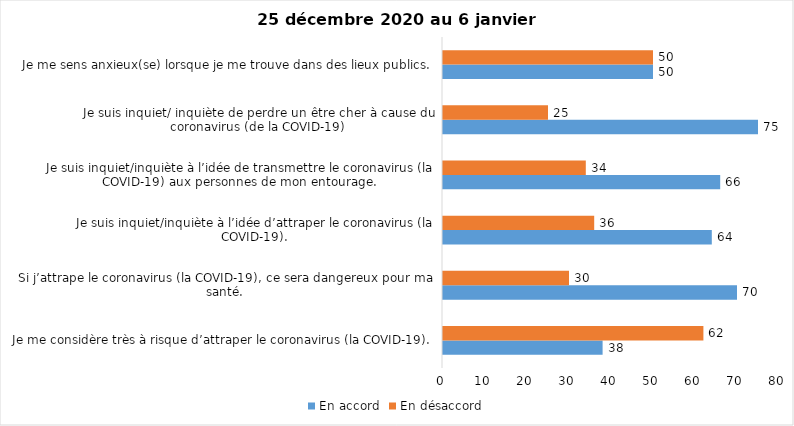
| Category | En accord | En désaccord |
|---|---|---|
| Je me considère très à risque d’attraper le coronavirus (la COVID-19). | 38 | 62 |
| Si j’attrape le coronavirus (la COVID-19), ce sera dangereux pour ma santé. | 70 | 30 |
| Je suis inquiet/inquiète à l’idée d’attraper le coronavirus (la COVID-19). | 64 | 36 |
| Je suis inquiet/inquiète à l’idée de transmettre le coronavirus (la COVID-19) aux personnes de mon entourage. | 66 | 34 |
| Je suis inquiet/ inquiète de perdre un être cher à cause du coronavirus (de la COVID-19) | 75 | 25 |
| Je me sens anxieux(se) lorsque je me trouve dans des lieux publics. | 50 | 50 |